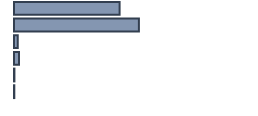
| Category | Percentatge |
|---|---|
| 0 | 44 |
| 1 | 52.043 |
| 2 | 1.609 |
| 3 | 2.043 |
| 4 | 0.174 |
| 5 | 0.13 |